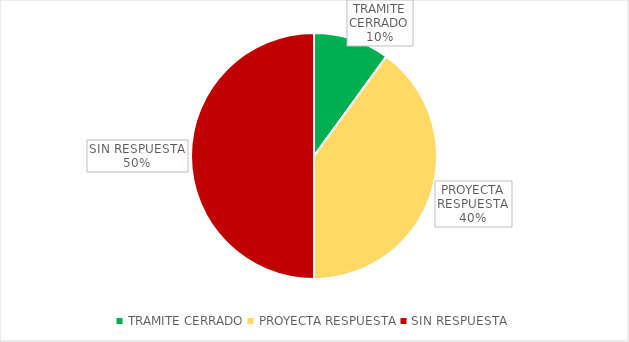
| Category | Series 0 |
|---|---|
| TRAMITE CERRADO | 4 |
| PROYECTA RESPUESTA | 16 |
| SIN RESPUESTA | 20 |